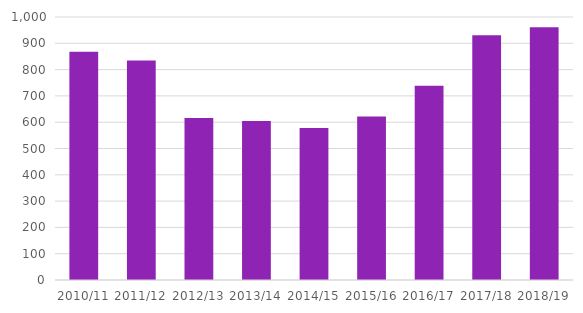
| Category | Series 0 |
|---|---|
| 2010/11 | 868 |
| 2011/12 | 835 |
| 2012/13 | 616 |
| 2013/14 | 605 |
| 2014/15 | 578 |
| 2015/16 | 622 |
| 2016/17 | 739 |
| 2017/18 | 931 |
| 2018/19 | 961 |